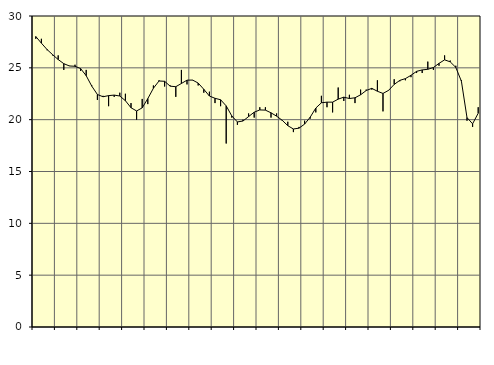
| Category | Piggar | Series 1 |
|---|---|---|
| nan | 27.8 | 28.02 |
| 1.0 | 27.8 | 27.38 |
| 1.0 | 26.7 | 26.77 |
| 1.0 | 26.2 | 26.27 |
| nan | 26.2 | 25.8 |
| 2.0 | 24.8 | 25.4 |
| 2.0 | 25.2 | 25.18 |
| 2.0 | 25.3 | 25.15 |
| nan | 24.7 | 24.93 |
| 3.0 | 24.8 | 24.24 |
| 3.0 | 23.3 | 23.23 |
| 3.0 | 21.9 | 22.43 |
| nan | 22.3 | 22.21 |
| 4.0 | 21.3 | 22.32 |
| 4.0 | 22.2 | 22.37 |
| 4.0 | 22.6 | 22.28 |
| nan | 22.5 | 21.83 |
| 5.0 | 21.6 | 21.15 |
| 5.0 | 20 | 20.84 |
| 5.0 | 22 | 21.14 |
| nan | 21.5 | 22.03 |
| 6.0 | 23.3 | 23.03 |
| 6.0 | 23.8 | 23.73 |
| 6.0 | 23.2 | 23.7 |
| nan | 23.3 | 23.23 |
| 7.0 | 22.2 | 23.18 |
| 7.0 | 24.8 | 23.49 |
| 7.0 | 23.4 | 23.81 |
| nan | 23.8 | 23.82 |
| 8.0 | 23.3 | 23.53 |
| 8.0 | 22.6 | 22.93 |
| 8.0 | 22.7 | 22.28 |
| nan | 21.6 | 22.06 |
| 9.0 | 21.3 | 21.92 |
| 9.0 | 17.7 | 21.33 |
| 9.0 | 20.2 | 20.36 |
| nan | 19.5 | 19.78 |
| 10.0 | 20 | 19.87 |
| 10.0 | 20.6 | 20.3 |
| 10.0 | 20.2 | 20.72 |
| nan | 21.2 | 20.94 |
| 11.0 | 21.2 | 20.92 |
| 11.0 | 20.2 | 20.66 |
| 11.0 | 20.6 | 20.34 |
| nan | 19.9 | 19.94 |
| 12.0 | 19.8 | 19.42 |
| 12.0 | 18.8 | 19.1 |
| 12.0 | 19.3 | 19.18 |
| nan | 19.9 | 19.57 |
| 13.0 | 20.1 | 20.24 |
| 13.0 | 20.7 | 21.12 |
| 13.0 | 22.3 | 21.63 |
| nan | 21.2 | 21.69 |
| 14.0 | 20.7 | 21.69 |
| 14.0 | 23.1 | 21.98 |
| 14.0 | 21.8 | 22.17 |
| nan | 22.4 | 22.04 |
| 15.0 | 21.6 | 22.11 |
| 15.0 | 22.9 | 22.4 |
| 15.0 | 22.9 | 22.81 |
| nan | 22.9 | 23.02 |
| 16.0 | 23.8 | 22.74 |
| 16.0 | 20.8 | 22.53 |
| 16.0 | 22.8 | 22.83 |
| nan | 23.9 | 23.4 |
| 17.0 | 23.7 | 23.79 |
| 17.0 | 23.8 | 23.96 |
| 17.0 | 24.1 | 24.28 |
| nan | 24.5 | 24.66 |
| 18.0 | 24.5 | 24.8 |
| 18.0 | 25.6 | 24.86 |
| 18.0 | 24.8 | 25.03 |
| nan | 25.2 | 25.43 |
| 19.0 | 26.2 | 25.77 |
| 19.0 | 25.7 | 25.58 |
| 19.0 | 25.2 | 25.04 |
| nan | 23.8 | 23.71 |
| 20.0 | 19.9 | 20.2 |
| 20.0 | 19.3 | 19.6 |
| 20.0 | 21.2 | 20.62 |